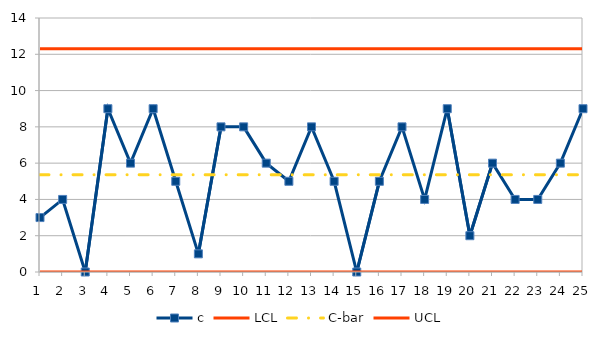
| Category | c | LCL | C-bar | UCL |
|---|---|---|---|---|
| 0 | 3 | 0 | 5.36 | 12.306 |
| 1 | 4 | 0 | 5.36 | 12.306 |
| 2 | 0 | 0 | 5.36 | 12.306 |
| 3 | 9 | 0 | 5.36 | 12.306 |
| 4 | 6 | 0 | 5.36 | 12.306 |
| 5 | 9 | 0 | 5.36 | 12.306 |
| 6 | 5 | 0 | 5.36 | 12.306 |
| 7 | 1 | 0 | 5.36 | 12.306 |
| 8 | 8 | 0 | 5.36 | 12.306 |
| 9 | 8 | 0 | 5.36 | 12.306 |
| 10 | 6 | 0 | 5.36 | 12.306 |
| 11 | 5 | 0 | 5.36 | 12.306 |
| 12 | 8 | 0 | 5.36 | 12.306 |
| 13 | 5 | 0 | 5.36 | 12.306 |
| 14 | 0 | 0 | 5.36 | 12.306 |
| 15 | 5 | 0 | 5.36 | 12.306 |
| 16 | 8 | 0 | 5.36 | 12.306 |
| 17 | 4 | 0 | 5.36 | 12.306 |
| 18 | 9 | 0 | 5.36 | 12.306 |
| 19 | 2 | 0 | 5.36 | 12.306 |
| 20 | 6 | 0 | 5.36 | 12.306 |
| 21 | 4 | 0 | 5.36 | 12.306 |
| 22 | 4 | 0 | 5.36 | 12.306 |
| 23 | 6 | 0 | 5.36 | 12.306 |
| 24 | 9 | 0 | 5.36 | 12.306 |